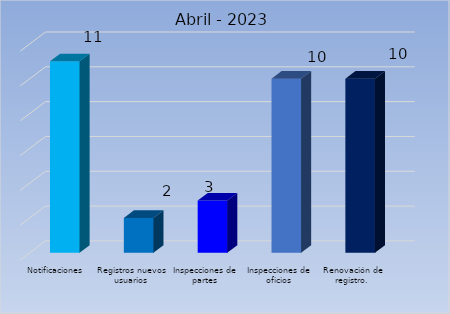
| Category | Cantidad |
|---|---|
| Notificaciones | 11 |
| Registros nuevos usuarios | 2 |
| Inspecciones de partes | 3 |
| Inspecciones de oficios | 10 |
| Renovación de registro.  | 10 |